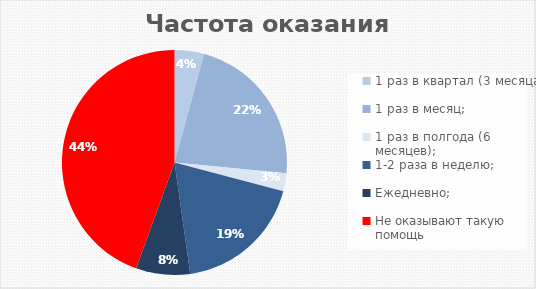
| Category | Итог |
|---|---|
| 1 раз в квартал (3 месяца); | 36 |
| 1 раз в месяц; | 189 |
| 1 раз в полгода (6 месяцев); | 22 |
| 1-2 раза в неделю; | 158 |
| Ежедневно; | 66 |
| Не оказывают такую помощь | 377 |